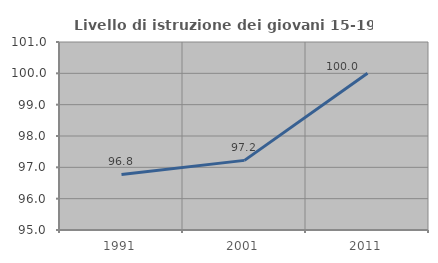
| Category | Livello di istruzione dei giovani 15-19 anni |
|---|---|
| 1991.0 | 96.774 |
| 2001.0 | 97.222 |
| 2011.0 | 100 |